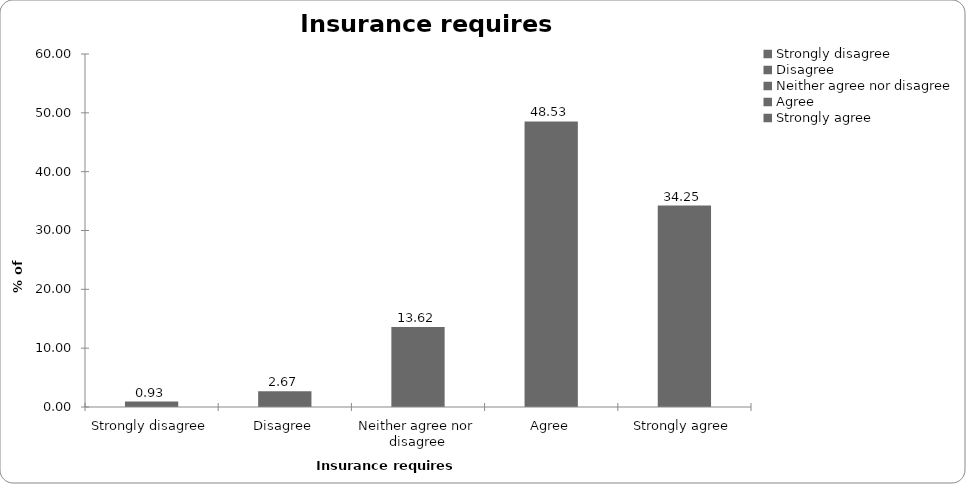
| Category | Insurance requires regulation |
|---|---|
| Strongly disagree | 0.935 |
| Disagree | 2.67 |
| Neither agree nor disagree | 13.618 |
| Agree | 48.531 |
| Strongly agree | 34.246 |